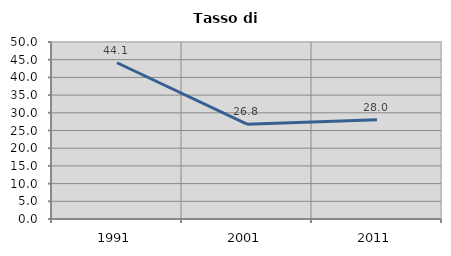
| Category | Tasso di disoccupazione   |
|---|---|
| 1991.0 | 44.137 |
| 2001.0 | 26.795 |
| 2011.0 | 28.009 |